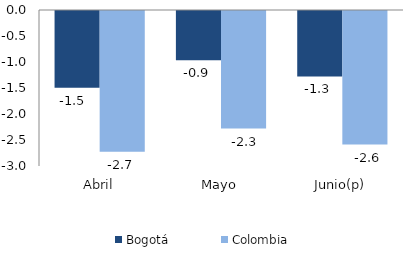
| Category | Bogotá | Colombia |
|---|---|---|
| Abril | -1.475 | -2.707 |
| Mayo | -0.948 | -2.26 |
| Junio(p) | -1.259 | -2.569 |